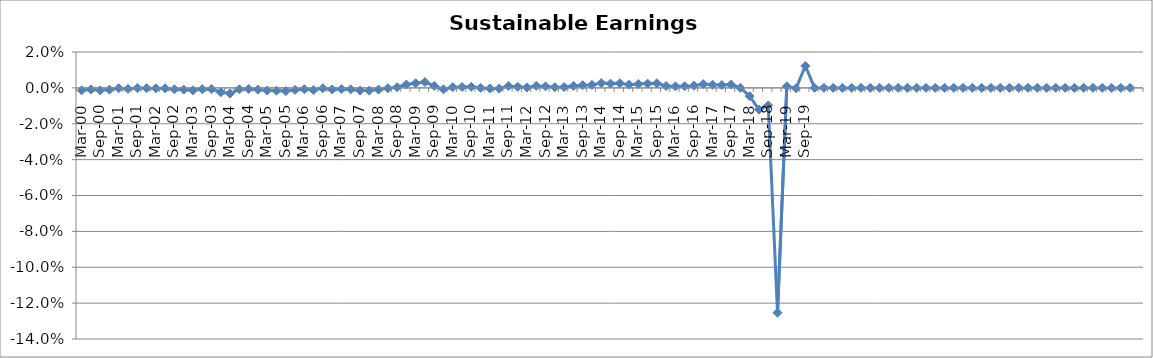
| Category | Sustainable Earnings Indicator |
|---|---|
| Mar-00 | -0.001 |
| Jun-00 | -0.001 |
| Sep-00 | -0.001 |
| Dec-00 | -0.001 |
| Mar-01 | 0 |
| Jun-01 | -0.001 |
| Sep-01 | 0 |
| Dec-01 | 0 |
| Mar-02 | 0 |
| Jun-02 | 0 |
| Sep-02 | -0.001 |
| Dec-02 | -0.001 |
| Mar-03 | -0.001 |
| Jun-03 | -0.001 |
| Sep-03 | -0.001 |
| Dec-03 | -0.002 |
| Mar-04 | -0.003 |
| Jun-04 | -0.001 |
| Sep-04 | -0.001 |
| Dec-04 | -0.001 |
| Mar-05 | -0.001 |
| Jun-05 | -0.002 |
| Sep-05 | -0.002 |
| Dec-05 | -0.001 |
| Mar-06 | -0.001 |
| Jun-06 | -0.001 |
| Sep-06 | 0 |
| Dec-06 | -0.001 |
| Mar-07 | -0.001 |
| Jun-07 | -0.001 |
| Sep-07 | -0.001 |
| Dec-07 | -0.002 |
| Mar-08 | -0.001 |
| Jun-08 | 0 |
| Sep-08 | 0 |
| Dec-08 | 0.002 |
| Mar-09 | 0.003 |
| Jun-09 | 0.003 |
| Sep-09 | 0.001 |
| Dec-09 | -0.001 |
| Mar-10 | 0 |
| Jun-10 | 0 |
| Sep-10 | 0.001 |
| Dec-10 | 0 |
| Mar-11 | 0 |
| Jun-11 | 0 |
| Sep-11 | 0.001 |
| Dec-11 | 0.001 |
| Mar-12 | 0 |
| Jun-12 | 0.001 |
| Sep-12 | 0.001 |
| Dec-12 | 0 |
| Mar-13 | 0 |
| Jun-13 | 0.001 |
| Sep-13 | 0.001 |
| Dec-13 | 0.002 |
| Mar-14 | 0.003 |
| Jun-14 | 0.002 |
| Sep-14 | 0.003 |
| Dec-14 | 0.002 |
| Mar-15 | 0.002 |
| Jun-15 | 0.002 |
| Sep-15 | 0.003 |
| Dec-15 | 0.001 |
| Mar-16 | 0.001 |
| Jun-16 | 0.001 |
| Sep-16 | 0.001 |
| Dec-16 | 0.002 |
| Mar-17 | 0.002 |
| Jun-17 | 0.002 |
| Sep-17 | 0.002 |
| Dec-17 | 0 |
| Mar-18 | -0.005 |
| Jun-18 | -0.012 |
| Sep-18 | -0.01 |
| Dec-18 | -0.125 |
| Mar-19 | 0.001 |
| Jun-19 | 0 |
| Sep-19 | 0.012 |